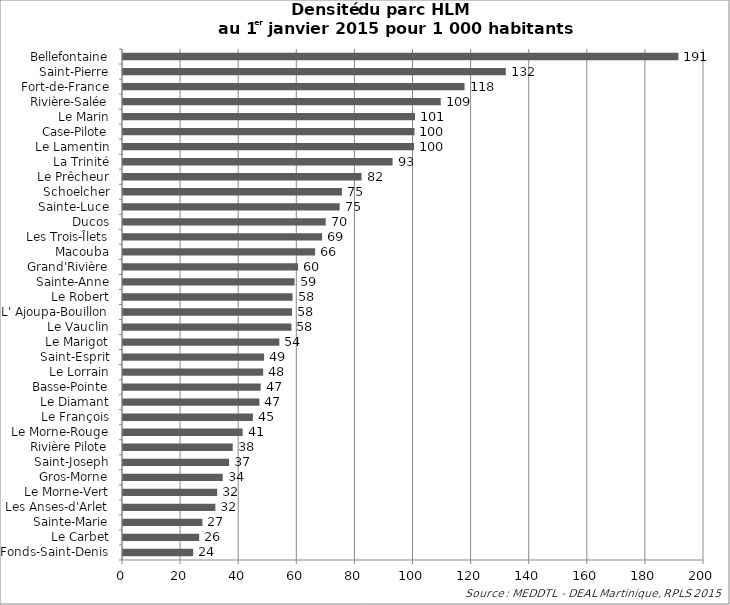
| Category | Series 0 |
|---|---|
| Fonds-Saint-Denis | 24.155 |
| Le Carbet | 26.231 |
| Sainte-Marie | 27.332 |
| Les Anses-d'Arlet | 31.795 |
| Le Morne-Vert | 32.43 |
| Gros-Morne | 34.341 |
| Saint-Joseph | 36.521 |
| Rivière Pilote | 37.776 |
| Le Morne-Rouge | 41.175 |
| Le François | 44.711 |
| Le Diamant | 46.966 |
| Basse-Pointe | 47.382 |
| Le Lorrain | 48.259 |
| Saint-Esprit | 48.567 |
| Le Marigot | 53.812 |
| Le Vauclin | 57.987 |
| L' Ajoupa-Bouillon | 58.166 |
| Le Robert | 58.36 |
| Sainte-Anne | 59.069 |
| Grand'Rivière | 60.264 |
| Macouba | 66.13 |
| Les Trois-Îlets | 68.538 |
| Ducos | 69.781 |
| Sainte-Luce | 74.581 |
| Schoelcher | 75.362 |
| Le Prêcheur | 82.117 |
| La Trinité | 92.795 |
| Le Lamentin | 100.202 |
| Case-Pilote | 100.337 |
| Le Marin | 100.503 |
| Rivière-Salée | 109.38 |
| Fort-de-France | 117.56 |
| Saint-Pierre | 131.767 |
| Bellefontaine | 191.196 |